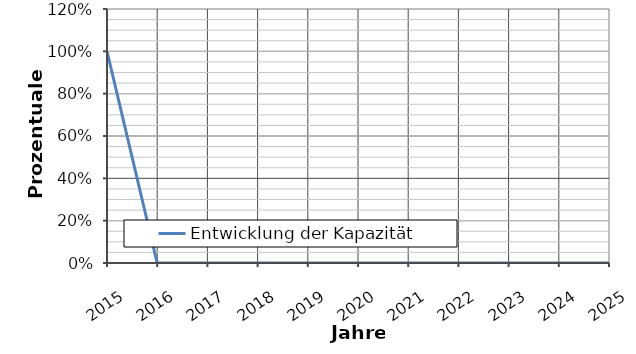
| Category | Entwicklung der Kapazität |
|---|---|
| 2015.0 | 1 |
| 2016.0 | 0 |
| 2017.0 | 0 |
| 2018.0 | 0 |
| 2019.0 | 0 |
| 2020.0 | 0 |
| 2021.0 | 0 |
| 2022.0 | 0 |
| 2023.0 | 0 |
| 2024.0 | 0 |
| 2025.0 | 0 |